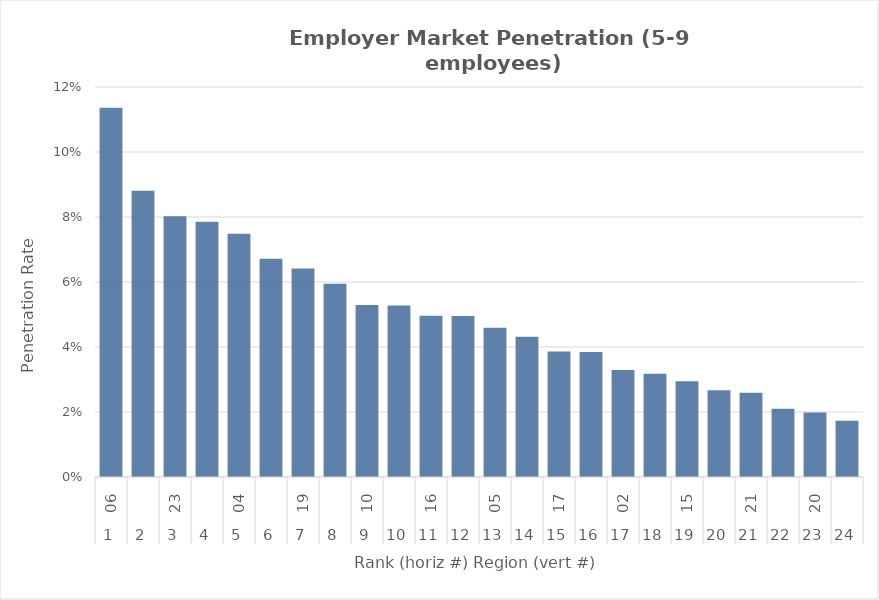
| Category | Rate |
|---|---|
| 0 | 0.114 |
| 1 | 0.088 |
| 2 | 0.08 |
| 3 | 0.079 |
| 4 | 0.075 |
| 5 | 0.067 |
| 6 | 0.064 |
| 7 | 0.059 |
| 8 | 0.053 |
| 9 | 0.053 |
| 10 | 0.05 |
| 11 | 0.05 |
| 12 | 0.046 |
| 13 | 0.043 |
| 14 | 0.039 |
| 15 | 0.038 |
| 16 | 0.033 |
| 17 | 0.032 |
| 18 | 0.029 |
| 19 | 0.027 |
| 20 | 0.026 |
| 21 | 0.021 |
| 22 | 0.02 |
| 23 | 0.017 |